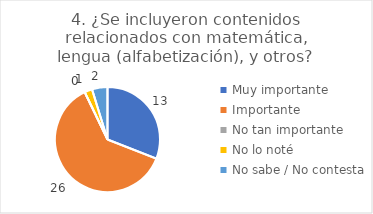
| Category | 4. ¿Se incluyeron contenidos relacionados con matemática, lengua (alfabetización), y otros? |
|---|---|
| Muy importante  | 0.31 |
| Importante  | 0.619 |
| No tan importante  | 0 |
| No lo noté  | 0.024 |
| No sabe / No contesta | 0.048 |